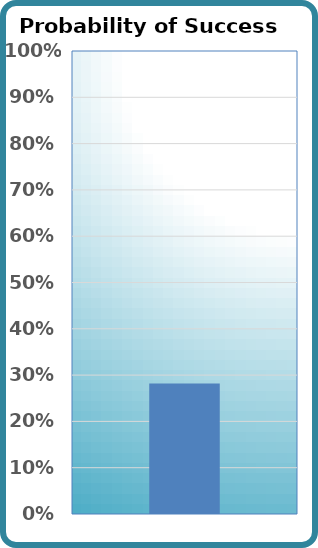
| Category | Probability of Success |
|---|---|
| 0 | 0.282 |